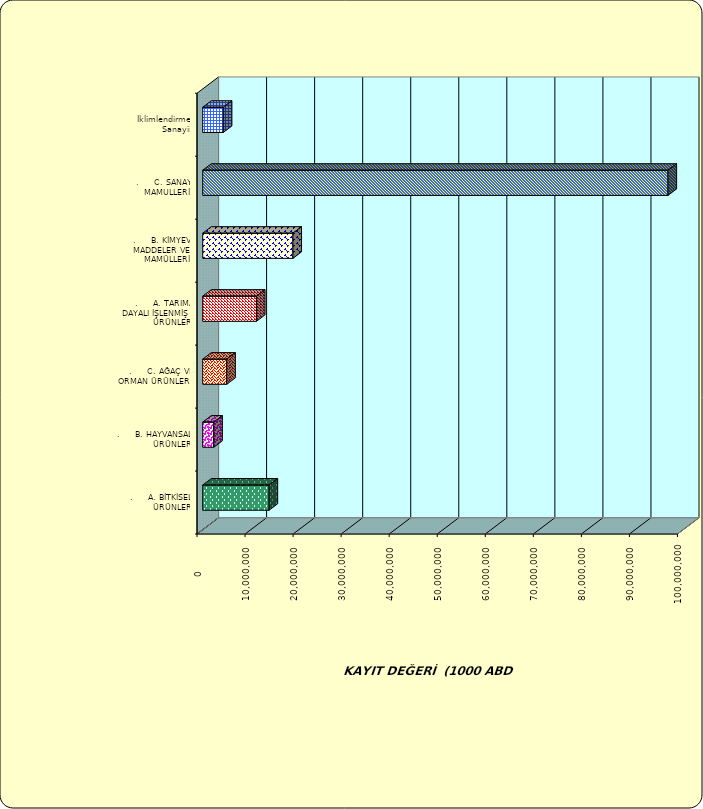
| Category | Series 0 |
|---|---|
| .     A. BİTKİSEL ÜRÜNLER | 13817119.276 |
| .     B. HAYVANSAL ÜRÜNLER | 2304445.48 |
| .     C. AĞAÇ VE ORMAN ÜRÜNLERİ | 5007810.643 |
| .     A. TARIMA DAYALI İŞLENMİŞ ÜRÜNLER | 11185294.636 |
| .     B. KİMYEVİ MADDELER VE MAMÜLLERİ | 18778623.558 |
| .     C. SANAYİ MAMULLERİ | 96846834.596 |
|  İklimlendirme Sanayii | 4288349.719 |